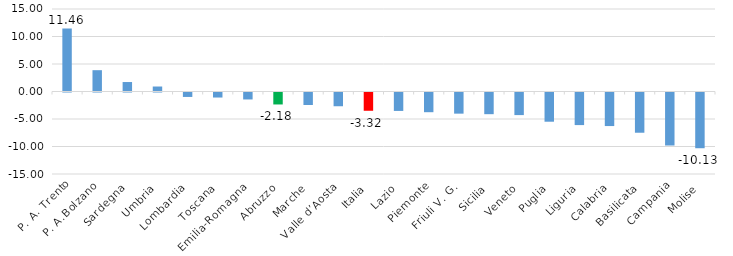
| Category | Variazione % 2018/2010 |
|---|---|
| P. A. Trento | 11.456 |
| P. A.Bolzano | 3.876 |
| Sardegna | 1.722 |
| Umbria | 0.907 |
| Lombardia | -0.809 |
| Toscana | -0.915 |
| Emilia-Romagna | -1.266 |
| Abruzzo | -2.176 |
| Marche | -2.274 |
| Valle d’Aosta | -2.499 |
| Italia | -3.323 |
| Lazio | -3.352 |
| Piemonte | -3.582 |
| Friuli V. G. | -3.845 |
| Sicilia | -3.942 |
| Veneto | -4.108 |
| Puglia | -5.312 |
| Liguria | -5.924 |
| Calabria | -6.101 |
| Basilicata | -7.315 |
| Campania | -9.637 |
| Molise | -10.132 |